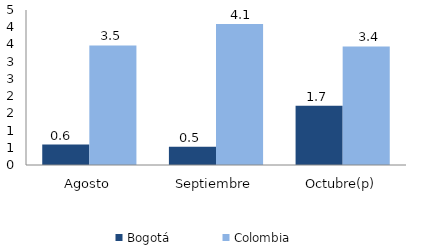
| Category | Bogotá | Colombia |
|---|---|---|
| Agosto | 0.593 | 3.471 |
| Septiembre | 0.527 | 4.093 |
| Octubre(p) | 1.719 | 3.442 |